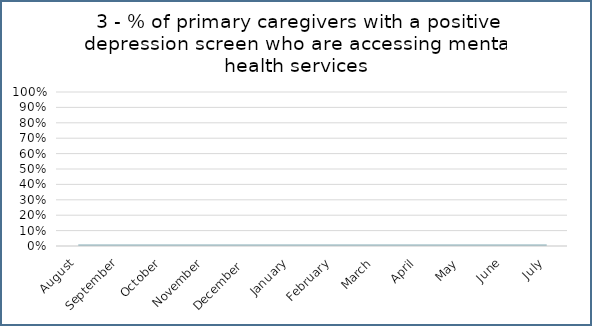
| Category | Series 0 |
|---|---|
| August | 0 |
| September | 0 |
| October | 0 |
| November | 0 |
| December  | 0 |
| January | 0 |
| February | 0 |
| March | 0 |
| April | 0 |
| May | 0 |
| June | 0 |
| July | 0 |